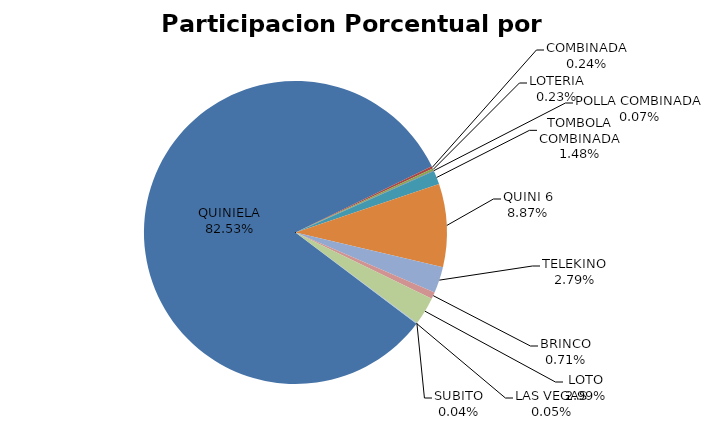
| Category | Series 0 |
|---|---|
| QUINIELA | 21686980.68 |
| COMBINADA | 63154.8 |
| LOTERIA | 60733.8 |
| POLLA COMBINADA | 18120.6 |
| TOMBOLA COMBINADA | 388428 |
| QUINI 6 | 2330775.52 |
| TELEKINO | 734410.6 |
| BRINCO | 186696 |
| LOTO | 785377.8 |
| SUBITO | 11814 |
| LAS VEGAS | 11998.95 |